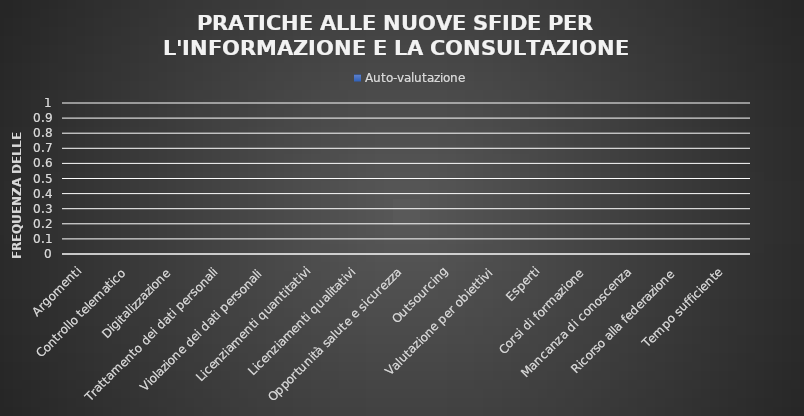
| Category | Auto-valutazione |
|---|---|
| Argomenti | 0 |
| Controllo telematico | 0 |
| Digitalizzazione | 0 |
| Trattamento dei dati personali | 0 |
| Violazione dei dati personali | 0 |
| Licenziamenti quantitativi | 0 |
| Licenziamenti qualitativi | 0 |
| Opportunità salute e sicurezza | 0 |
| Outsourcing | 0 |
| Valutazione per obiettivi | 0 |
| Esperti | 0 |
| Corsi di formazione | 0 |
| Mancanza di conoscenza | 0 |
| Ricorso alla federazione | 0 |
| Tempo sufficiente | 0 |